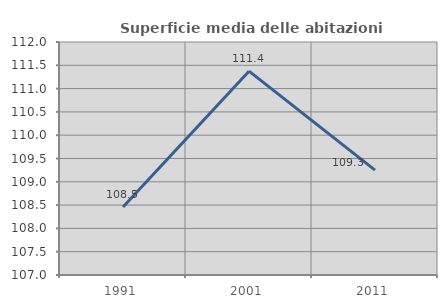
| Category | Superficie media delle abitazioni occupate |
|---|---|
| 1991.0 | 108.458 |
| 2001.0 | 111.374 |
| 2011.0 | 109.251 |